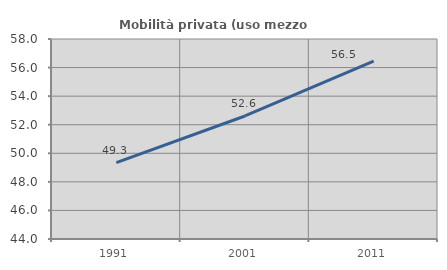
| Category | Mobilità privata (uso mezzo privato) |
|---|---|
| 1991.0 | 49.346 |
| 2001.0 | 52.612 |
| 2011.0 | 56.458 |